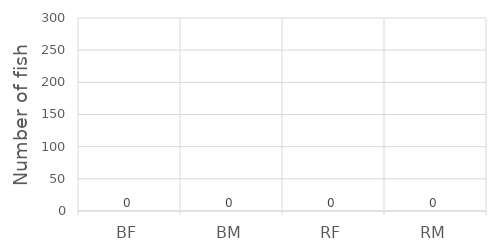
| Category | Series 0 |
|---|---|
| BF | 0 |
| BM | 0 |
| RF | 0 |
| RM | 0 |